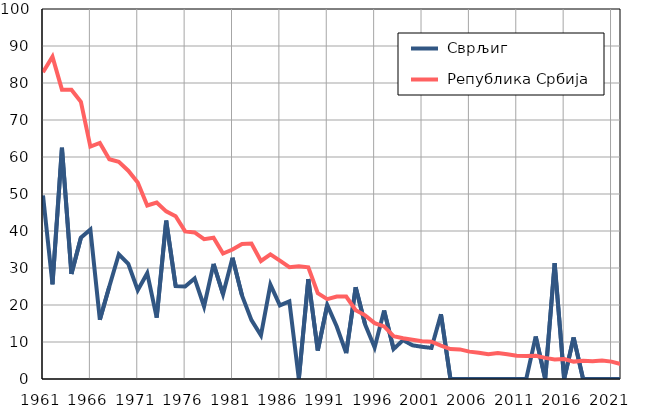
| Category |  Сврљиг |  Република Србија |
|---|---|---|
| 1961.0 | 49.6 | 82.9 |
| 1962.0 | 25.6 | 87.1 |
| 1963.0 | 62.5 | 78.2 |
| 1964.0 | 28.4 | 78.2 |
| 1965.0 | 38.2 | 74.9 |
| 1966.0 | 40.4 | 62.8 |
| 1967.0 | 16 | 63.8 |
| 1968.0 | 25 | 59.4 |
| 1969.0 | 33.7 | 58.7 |
| 1970.0 | 31.1 | 56.3 |
| 1971.0 | 24 | 53.1 |
| 1972.0 | 28.6 | 46.9 |
| 1973.0 | 16.6 | 47.7 |
| 1974.0 | 42.8 | 45.3 |
| 1975.0 | 25.1 | 44 |
| 1976.0 | 25 | 39.9 |
| 1977.0 | 27.2 | 39.6 |
| 1978.0 | 19.6 | 37.8 |
| 1979.0 | 31.1 | 38.2 |
| 1980.0 | 22.9 | 33.9 |
| 1981.0 | 32.8 | 35 |
| 1982.0 | 22.6 | 36.5 |
| 1983.0 | 15.9 | 36.6 |
| 1984.0 | 11.8 | 31.9 |
| 1985.0 | 25.5 | 33.7 |
| 1986.0 | 19.9 | 32 |
| 1987.0 | 21 | 30.2 |
| 1988.0 | 0 | 30.5 |
| 1989.0 | 27 | 30.2 |
| 1990.0 | 7.7 | 23.2 |
| 1991.0 | 20 | 21.6 |
| 1992.0 | 14.2 | 22.3 |
| 1993.0 | 7 | 22.3 |
| 1994.0 | 24.8 | 18.6 |
| 1995.0 | 14.7 | 17.2 |
| 1996.0 | 8.5 | 15.1 |
| 1997.0 | 18.5 | 14.2 |
| 1998.0 | 8.1 | 11.6 |
| 1999.0 | 10.5 | 11 |
| 2000.0 | 9.1 | 10.6 |
| 2001.0 | 8.7 | 10.2 |
| 2002.0 | 8.4 | 10.1 |
| 2003.0 | 17.5 | 9 |
| 2004.0 | 0 | 8.1 |
| 2005.0 | 0 | 8 |
| 2006.0 | 0 | 7.4 |
| 2007.0 | 0 | 7.1 |
| 2008.0 | 0 | 6.7 |
| 2009.0 | 0 | 7 |
| 2010.0 | 0 | 6.7 |
| 2011.0 | 0 | 6.3 |
| 2012.0 | 0 | 6.2 |
| 2013.0 | 11.5 | 6.3 |
| 2014.0 | 0 | 5.7 |
| 2015.0 | 31.3 | 5.3 |
| 2016.0 | 0 | 5.4 |
| 2017.0 | 11.2 | 4.7 |
| 2018.0 | 0 | 4.9 |
| 2019.0 | 0 | 4.8 |
| 2020.0 | 0 | 5 |
| 2021.0 | 0 | 4.7 |
| 2022.0 | 0 | 4 |